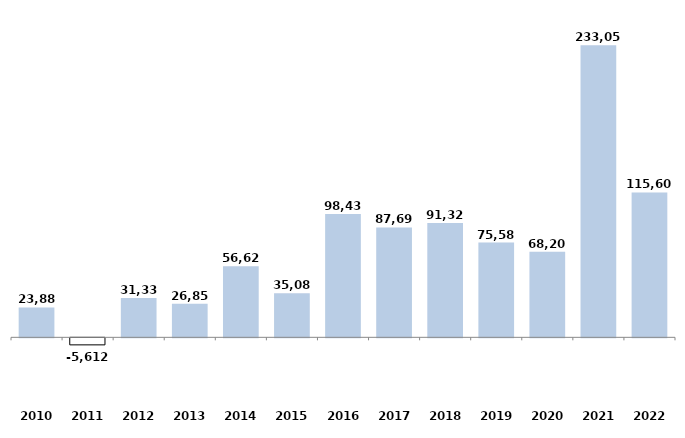
| Category | Series 0 |
|---|---|
| 2010 | 23884.34 |
| 2011 | -5612 |
| 2012 | 31332.21 |
| 2013 | 26852.91 |
| 2014 | 56621.86 |
| 2015 | 35085.05 |
| 2016 | 98431.55 |
| 2017 | 87692.32 |
| 2018 | 91322.38 |
| 2019 | 75583.745 |
| 2020 | 68208 |
| 2021 | 233056 |
| 2022 | 115606.818 |